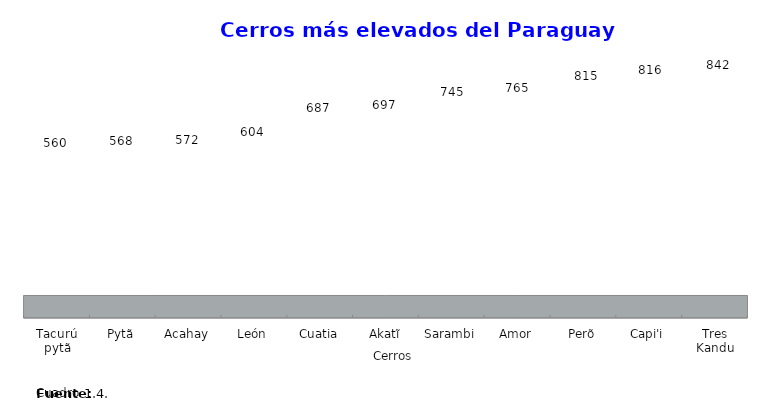
| Category | Altura (m) |
|---|---|
| Tacurú pytã | 560 |
| Pytã | 568 |
| Acahay | 572 |
| León | 604 |
| Cuatia | 687 |
| Akatĩ | 697 |
| Sarambi | 745 |
| Amor | 765 |
| Perõ | 815 |
| Capi'i | 816 |
| Tres Kandu | 842 |